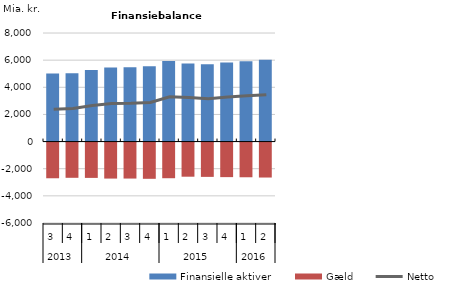
| Category | Finansielle aktiver | Gæld |
|---|---|---|
| 0 | 5016 | -2630 |
| 1 | 5029 | -2596 |
| 2 | 5268 | -2603 |
| 3 | 5450 | -2653 |
| 4 | 5468 | -2651 |
| 5 | 5546 | -2670 |
| 6 | 5929 | -2627 |
| 7 | 5760 | -2515 |
| 8 | 5690 | -2528 |
| 9 | 5824 | -2546 |
| 10 | 5925 | -2556 |
| 11 | 6033 | -2576 |